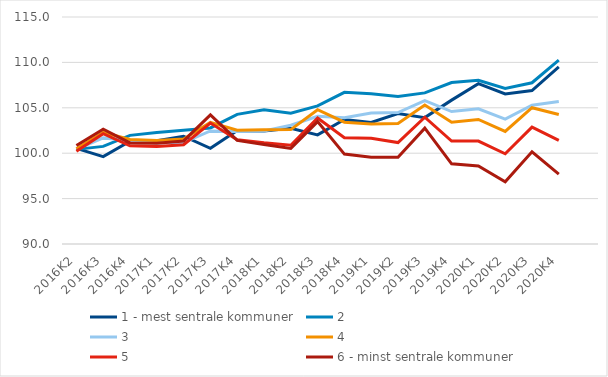
| Category | 1 - mest sentrale kommuner | 2 | 3 | 4 | 5 | 6 - minst sentrale kommuner |
|---|---|---|---|---|---|---|
| 2016K2 | 100.531 | 100.421 | 100.417 | 100.488 | 100.208 | 100.848 |
| 2016K3 | 99.621 | 100.75 | 101.685 | 102.287 | 102.145 | 102.646 |
| 2016K4 | 101.315 | 101.966 | 101.408 | 101.516 | 100.821 | 101.135 |
| 2017K1 | 101.361 | 102.269 | 101.118 | 101.392 | 100.731 | 101.087 |
| 2017K2 | 101.869 | 102.518 | 101.174 | 101.554 | 100.935 | 101.349 |
| 2017K3 | 100.542 | 102.783 | 102.449 | 103.394 | 103.327 | 104.214 |
| 2017K4 | 102.503 | 104.28 | 102.391 | 102.535 | 101.485 | 101.41 |
| 2018K1 | 102.44 | 104.784 | 102.452 | 102.574 | 101.14 | 100.95 |
| 2018K2 | 102.733 | 104.4 | 103.083 | 102.599 | 100.87 | 100.532 |
| 2018K3 | 102.019 | 105.206 | 104.068 | 104.786 | 103.871 | 103.481 |
| 2018K4 | 103.717 | 106.702 | 103.895 | 103.412 | 101.703 | 99.901 |
| 2019K1 | 103.392 | 106.556 | 104.428 | 103.218 | 101.65 | 99.554 |
| 2019K2 | 104.368 | 106.244 | 104.475 | 103.276 | 101.169 | 99.559 |
| 2019K3 | 103.919 | 106.644 | 105.8 | 105.303 | 103.962 | 102.754 |
| 2019K4 | 105.844 | 107.788 | 104.587 | 103.401 | 101.341 | 98.832 |
| 2020K1 | 107.663 | 108.023 | 104.897 | 103.712 | 101.331 | 98.589 |
| 2020K2 | 106.532 | 107.137 | 103.748 | 102.393 | 99.936 | 96.85 |
| 2020K3 | 106.899 | 107.759 | 105.287 | 105.014 | 102.875 | 100.148 |
| 2020K4 | 109.51 | 110.243 | 105.69 | 104.256 | 101.412 | 97.688 |